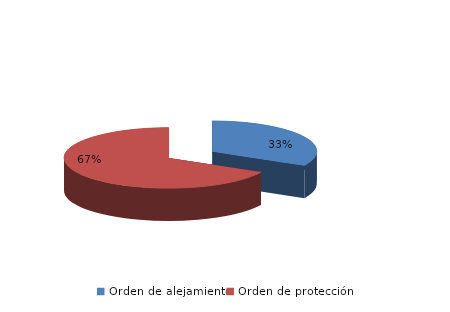
| Category | Series 0 |
|---|---|
| Orden de alejamiento | 194 |
| Orden de protección | 398 |